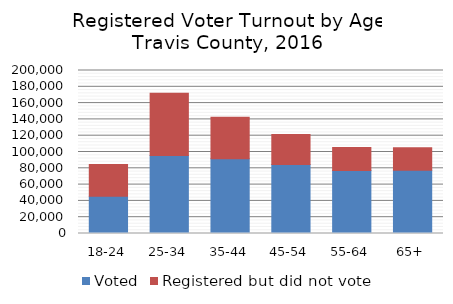
| Category | Voted | Registered but did not vote |
|---|---|---|
| 18-24 | 45756 | 38817 |
| 25-34 | 95758 | 76260 |
| 35-44 | 91733 | 50963 |
| 45-54 | 84796 | 36791 |
| 55-64 | 77423 | 28079 |
| 65+ | 77626 | 27626 |